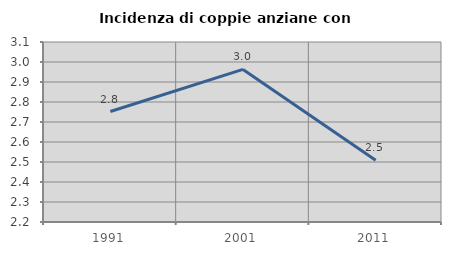
| Category | Incidenza di coppie anziane con figli |
|---|---|
| 1991.0 | 2.752 |
| 2001.0 | 2.963 |
| 2011.0 | 2.509 |